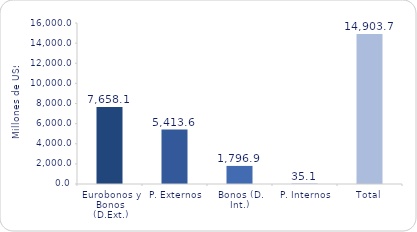
| Category | Series 1 |
|---|---|
| Eurobonos y Bonos (D.Ext.) | 7658.1 |
| P. Externos | 5413.6 |
| Bonos (D. Int.) | 1796.9 |
| P. Internos | 35.1 |
| Total | 14903.7 |